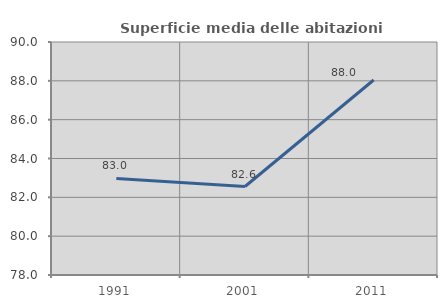
| Category | Superficie media delle abitazioni occupate |
|---|---|
| 1991.0 | 82.971 |
| 2001.0 | 82.556 |
| 2011.0 | 88.042 |